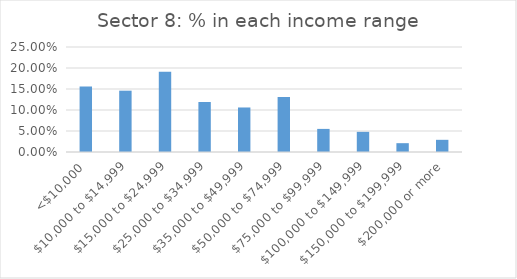
| Category | Series 0 |
|---|---|
| <$10,000 | 0.156 |
| $10,000 to $14,999 | 0.146 |
| $15,000 to $24,999 | 0.191 |
| $25,000 to $34,999 | 0.119 |
| $35,000 to $49,999 | 0.106 |
| $50,000 to $74,999 | 0.131 |
| $75,000 to $99,999 | 0.055 |
| $100,000 to $149,999 | 0.048 |
| $150,000 to $199,999 | 0.021 |
| $200,000 or more | 0.029 |